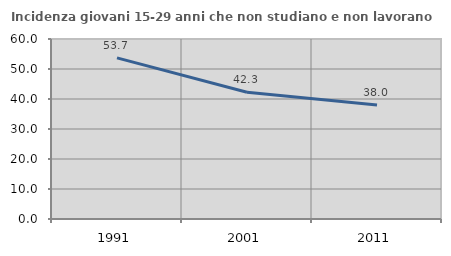
| Category | Incidenza giovani 15-29 anni che non studiano e non lavorano  |
|---|---|
| 1991.0 | 53.722 |
| 2001.0 | 42.254 |
| 2011.0 | 38 |